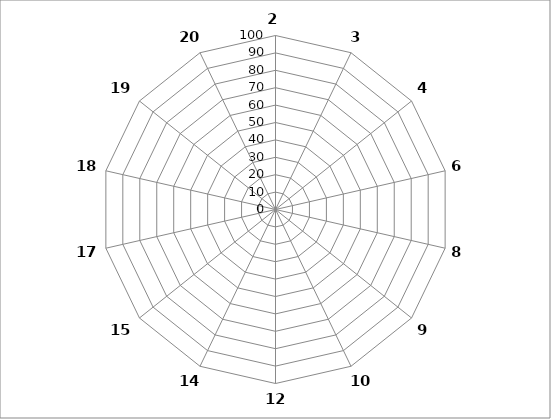
| Category | Series 0 |
|---|---|
| 2.0 | 0 |
| 3.0 | 0 |
| 4.0 | 0 |
| 6.0 | 0 |
| 8.0 | 0 |
| 9.0 | 0 |
| 10.0 | 0 |
| 12.0 | 0 |
| 14.0 | 0 |
| 15.0 | 0 |
| 17.0 | 0 |
| 18.0 | 0 |
| 19.0 | 0 |
| 20.0 | 0 |